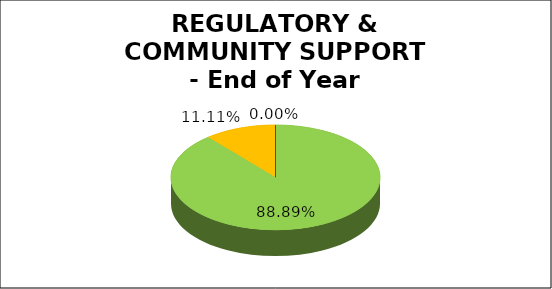
| Category | Q4 |
|---|---|
| Green | 0.889 |
| Amber | 0.111 |
| Red | 0 |